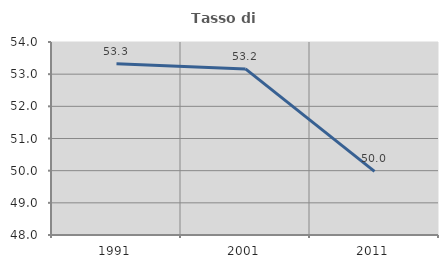
| Category | Tasso di occupazione   |
|---|---|
| 1991.0 | 53.327 |
| 2001.0 | 53.162 |
| 2011.0 | 49.977 |